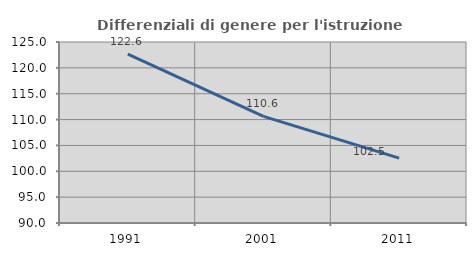
| Category | Differenziali di genere per l'istruzione superiore |
|---|---|
| 1991.0 | 122.636 |
| 2001.0 | 110.606 |
| 2011.0 | 102.533 |